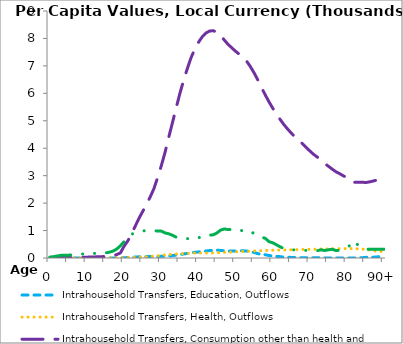
| Category | Intrahousehold Transfers, Education, Outflows | Intrahousehold Transfers, Health, Outflows | Intrahousehold Transfers, Consumption other than health and education, Outflows | Intrahousehold Transfers, Saving, Outflows |
|---|---|---|---|---|
| 0 | 0.104 | 0.013 | 9.314 | 32.612 |
|  | 0.162 | 0.047 | 10.501 | 49.528 |
| 2 | 0.253 | 0.163 | 11.839 | 75.216 |
| 3 | 0.312 | 0.407 | 13.345 | 96.069 |
| 4 | 0.187 | 0.751 | 14.963 | 99.905 |
| 5 | 0.146 | 0.986 | 16.758 | 102.733 |
| 6 | 0.141 | 0.92 | 18.748 | 113.117 |
| 7 | 0.135 | 0.782 | 20.949 | 109.235 |
| 8 | 0.181 | 0.773 | 23.381 | 119.701 |
| 9 | 0.273 | 0.799 | 26.817 | 151.84 |
| 10 | 0.237 | 0.878 | 30.714 | 148.505 |
| 11 | 0.211 | 1.116 | 34.939 | 145.628 |
| 12 | 0.194 | 1.348 | 39.346 | 166.808 |
| 13 | 0.191 | 1.557 | 44.275 | 189.62 |
| 14 | 0.272 | 1.936 | 48.695 | 170.373 |
| 15 | 0.576 | 2.424 | 55.301 | 185.032 |
| 16 | 0.941 | 2.952 | 67.671 | 210.44 |
| 17 | 1.746 | 3.949 | 88.202 | 250.565 |
| 18 | 3.462 | 5.586 | 124.043 | 325.763 |
| 19 | 5.456 | 7.45 | 186.943 | 445.963 |
| 20 | 9.553 | 10.619 | 434.683 | 597.543 |
| 21 | 16.806 | 15.351 | 627.827 | 737.282 |
| 22 | 26.349 | 21.263 | 879.556 | 867.999 |
| 23 | 33.836 | 27.066 | 1165.688 | 916.115 |
| 24 | 43.613 | 34.807 | 1446.894 | 960.817 |
| 25 | 45.168 | 41.604 | 1696.06 | 983.571 |
| 26 | 50.785 | 48.384 | 1951.69 | 1001.465 |
| 27 | 52.46 | 56.649 | 2220.527 | 990.052 |
| 28 | 54.307 | 68.322 | 2522.354 | 993.032 |
| 29 | 50.939 | 80.252 | 2920.023 | 984.084 |
| 30 | 65.176 | 94.936 | 3360.685 | 980.197 |
| 31 | 66.133 | 110.957 | 3843.998 | 915.228 |
| 32 | 74.973 | 125.352 | 4397.494 | 882.109 |
| 33 | 88.052 | 135.581 | 4926.931 | 829.256 |
| 34 | 106.476 | 144.259 | 5465.495 | 756.98 |
| 35 | 123.417 | 150.958 | 5992.834 | 720.765 |
| 36 | 147.213 | 158.157 | 6467.69 | 722.534 |
| 37 | 164.875 | 165.175 | 6897.024 | 704.971 |
| 38 | 183.723 | 173.438 | 7293.899 | 710.988 |
| 39 | 207.4 | 180.125 | 7604.043 | 767.571 |
| 40 | 219.416 | 182.127 | 7856.915 | 754.986 |
| 41 | 238.448 | 181.846 | 8054.266 | 723.602 |
| 42 | 255.008 | 182.448 | 8196.474 | 767.188 |
| 43 | 270.634 | 182.56 | 8270.146 | 832.773 |
| 44 | 280.814 | 185.444 | 8281.818 | 845.873 |
| 45 | 284.987 | 191.076 | 8221.959 | 913.637 |
| 46 | 274.414 | 198.273 | 8097.99 | 1018.749 |
| 47 | 263.797 | 205.667 | 7937.949 | 1058.825 |
| 48 | 249.491 | 213.416 | 7781.207 | 1034.009 |
| 49 | 253.876 | 219.973 | 7656.588 | 1043.429 |
| 50 | 253.597 | 226.759 | 7532.331 | 1070.917 |
| 51 | 260.84 | 232.981 | 7422.706 | 1015.37 |
| 52 | 262.375 | 238.563 | 7312.722 | 988.168 |
| 53 | 253.074 | 243.199 | 7169.311 | 988.702 |
| 54 | 224.998 | 248.903 | 6969.882 | 986.889 |
| 55 | 201.405 | 255.457 | 6744.477 | 878.773 |
| 56 | 159.669 | 262.035 | 6483.63 | 813.955 |
| 57 | 128.048 | 267.384 | 6204.723 | 756.364 |
| 58 | 118.594 | 274.314 | 5938.623 | 717.609 |
| 59 | 91.945 | 279.698 | 5690.481 | 594.268 |
| 60 | 72.712 | 283.659 | 5459.015 | 554.871 |
| 61 | 57.7 | 287.283 | 5256.956 | 483.239 |
| 62 | 49.612 | 290.764 | 5048.917 | 407.12 |
| 63 | 29.948 | 293.791 | 4862.817 | 346.152 |
| 64 | 25.975 | 296.687 | 4701.523 | 328.069 |
| 65 | 21.914 | 299.871 | 4551.14 | 309.647 |
| 66 | 14.946 | 303.192 | 4408.741 | 289.181 |
| 67 | 11.629 | 307.07 | 4285.326 | 283.312 |
| 68 | 9.35 | 310.829 | 4165.713 | 271.987 |
| 69 | 9.739 | 314.34 | 4030.08 | 277.853 |
| 70 | 8.008 | 317.294 | 3899.651 | 261.747 |
| 71 | 8.738 | 319.895 | 3777.828 | 252.675 |
| 72 | 8.829 | 322.656 | 3676.557 | 265.976 |
| 73 | 10.678 | 325.445 | 3553.747 | 298.519 |
| 74 | 4.206 | 328.23 | 3443.493 | 273.191 |
| 75 | 3.056 | 331.142 | 3342.457 | 298.457 |
| 76 | 2.356 | 334.158 | 3240.029 | 320.407 |
| 77 | 2.356 | 336.88 | 3144.383 | 272.097 |
| 78 | 1.535 | 339.387 | 3074.478 | 280.756 |
| 79 | 1.239 | 341.224 | 2996.43 | 330.19 |
| 80 | 1.948 | 342.252 | 2925.291 | 398.07 |
| 81 | 2.891 | 342.089 | 2833.969 | 470.118 |
| 82 | 3.544 | 340.33 | 2757.959 | 625.49 |
| 83 | 5.422 | 333.603 | 2759.55 | 459.58 |
| 84 | 10.033 | 326.681 | 2764.525 | 391.155 |
| 85 | 22.226 | 313.46 | 2749.095 | 319.084 |
| 86 | 30.774 | 291.914 | 2771.775 | 319.084 |
| 87 | 26.505 | 270.652 | 2803.224 | 319.084 |
| 88 | 38.977 | 248.598 | 2837.597 | 319.084 |
| 89 | 57.726 | 236.741 | 2849.468 | 319.084 |
| 90+ | 85.492 | 234.853 | 2855.409 | 319.084 |